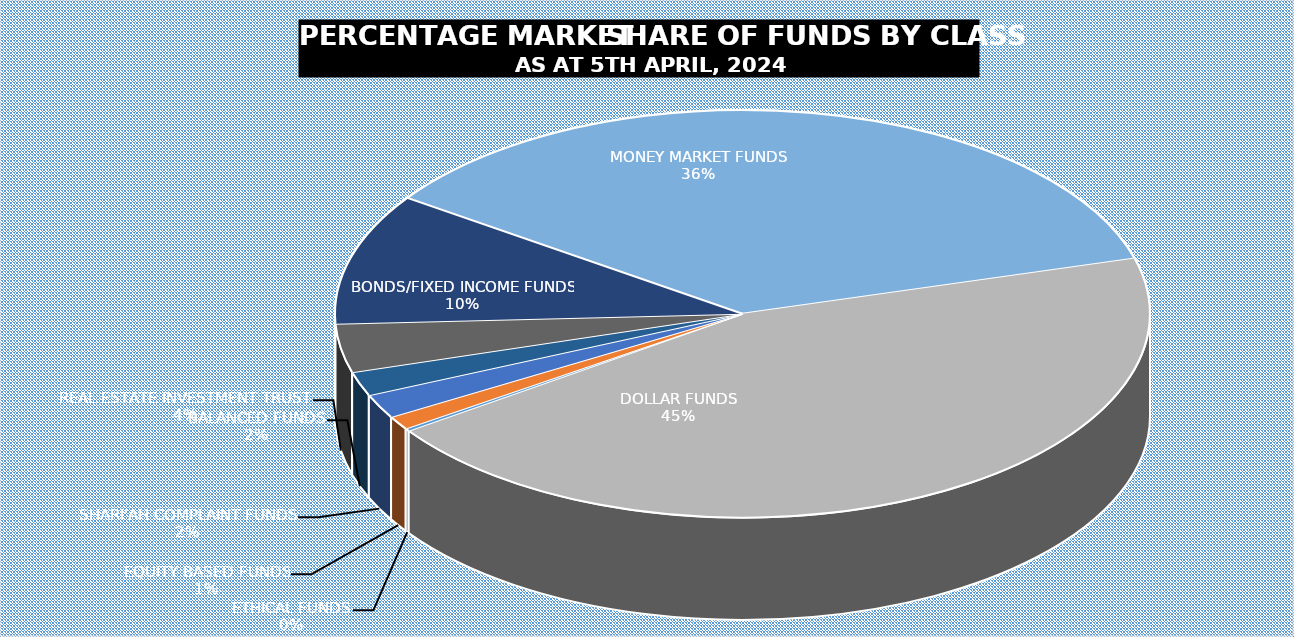
| Category | 5-Apr |
|---|---|
| ETHICAL FUNDS | 5149295610.36 |
| EQUITY BASED FUNDS | 27852455758.706 |
| SHARI'AH COMPLAINT FUNDS | 49480081538.382 |
| BALANCED FUNDS | 49320093297.825 |
| REAL ESTATE INVESTMENT TRUST | 99837132151.76 |
| BONDS/FIXED INCOME FUNDS | 269472046413.534 |
| MONEY MARKET FUNDS | 932135468254.624 |
| DOLLAR FUNDS | 1156417308460.856 |